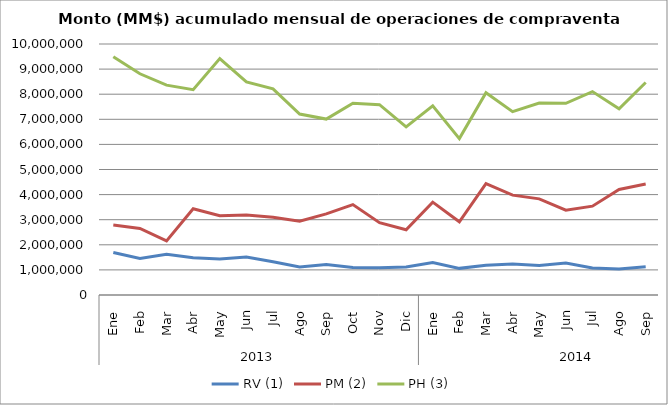
| Category | RV (1) | PM (2) | PH (3) |
|---|---|---|---|
| 0 | 1693090.019 | 2788692.01 | 9495719.157 |
| 1 | 1457870.523 | 2652319.476 | 8814454.346 |
| 2 | 1619570.46 | 2155113.626 | 8361658.957 |
| 3 | 1485677.791 | 3434435.881 | 8182321.991 |
| 4 | 1434943.507 | 3155786.06 | 9417818.094 |
| 5 | 1516566.545 | 3191285.457 | 8490151.421 |
| 6 | 1322115.523 | 3099755.507 | 8212010.547 |
| 7 | 1118245.895 | 2937089.197 | 7211658.784 |
| 8 | 1215047.725 | 3232334.418 | 7008526.172 |
| 9 | 1092035.083 | 3603082.09 | 7640993.748 |
| 10 | 1088055.605 | 2879188.198 | 7583918.365 |
| 11 | 1114851.326 | 2596986.123 | 6700659.979 |
| 12 | 1296256.43 | 3700290.091 | 7538361.261 |
| 13 | 1061199.219 | 2915830.381 | 6230064.605 |
| 14 | 1189463.212 | 4440910.02 | 8058380.739 |
| 15 | 1231035.305 | 3977428.452 | 7305106.144 |
| 16 | 1178985.046 | 3830415.456 | 7649023.753 |
| 17 | 1271543.287 | 3377453.657 | 7635505.378 |
| 18 | 1074038.901 | 3538491.307 | 8103978.154 |
| 19 | 1039238.343 | 4203748.491 | 7419437.742 |
| 20 | 1122686.945 | 4418671.366 | 8468015.825 |